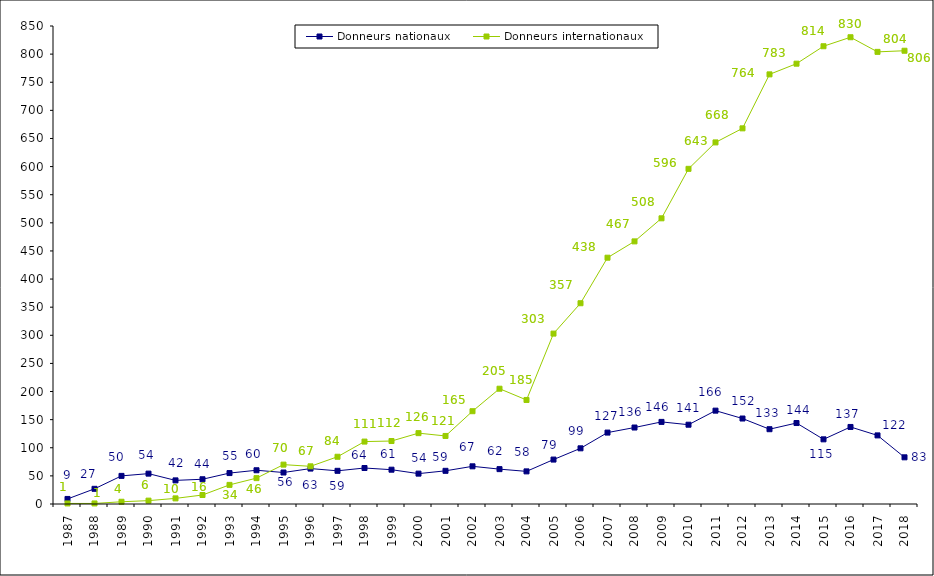
| Category | Donneurs nationaux | Donneurs internationaux |
|---|---|---|
| 1987.0 | 9 | 1 |
| 1988.0 | 27 | 1 |
| 1989.0 | 50 | 4 |
| 1990.0 | 54 | 6 |
| 1991.0 | 42 | 10 |
| 1992.0 | 44 | 16 |
| 1993.0 | 55 | 34 |
| 1994.0 | 60 | 46 |
| 1995.0 | 56 | 70 |
| 1996.0 | 63 | 67 |
| 1997.0 | 59 | 84 |
| 1998.0 | 64 | 111 |
| 1999.0 | 61 | 112 |
| 2000.0 | 54 | 126 |
| 2001.0 | 59 | 121 |
| 2002.0 | 67 | 165 |
| 2003.0 | 62 | 205 |
| 2004.0 | 58 | 185 |
| 2005.0 | 79 | 303 |
| 2006.0 | 99 | 357 |
| 2007.0 | 127 | 438 |
| 2008.0 | 136 | 467 |
| 2009.0 | 146 | 508 |
| 2010.0 | 141 | 596 |
| 2011.0 | 166 | 643 |
| 2012.0 | 152 | 668 |
| 2013.0 | 133 | 764 |
| 2014.0 | 144 | 783 |
| 2015.0 | 115 | 814 |
| 2016.0 | 137 | 830 |
| 2017.0 | 122 | 804 |
| 2018.0 | 83 | 806 |